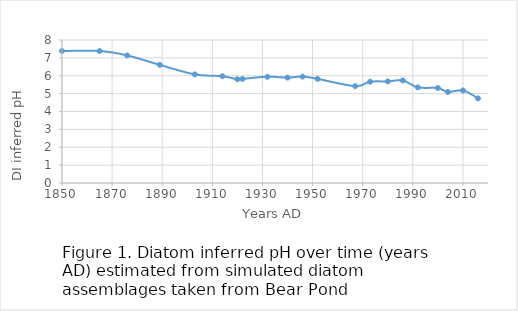
| Category | Years (AD) |
|---|---|
| 2016.0 | 4.736 |
| 2010.0 | 5.177 |
| 2004.0 | 5.095 |
| 2000.0 | 5.315 |
| 1992.0 | 5.348 |
| 1986.0 | 5.737 |
| 1980.0 | 5.682 |
| 1973.0 | 5.668 |
| 1967.0 | 5.418 |
| 1952.0 | 5.826 |
| 1946.0 | 5.953 |
| 1940.0 | 5.896 |
| 1932.0 | 5.945 |
| 1922.0 | 5.824 |
| 1920.0 | 5.802 |
| 1914.0 | 5.974 |
| 1903.0 | 6.076 |
| 1889.0 | 6.61 |
| 1876.0 | 7.139 |
| 1865.0 | 7.383 |
| 1850.0 | 7.384 |